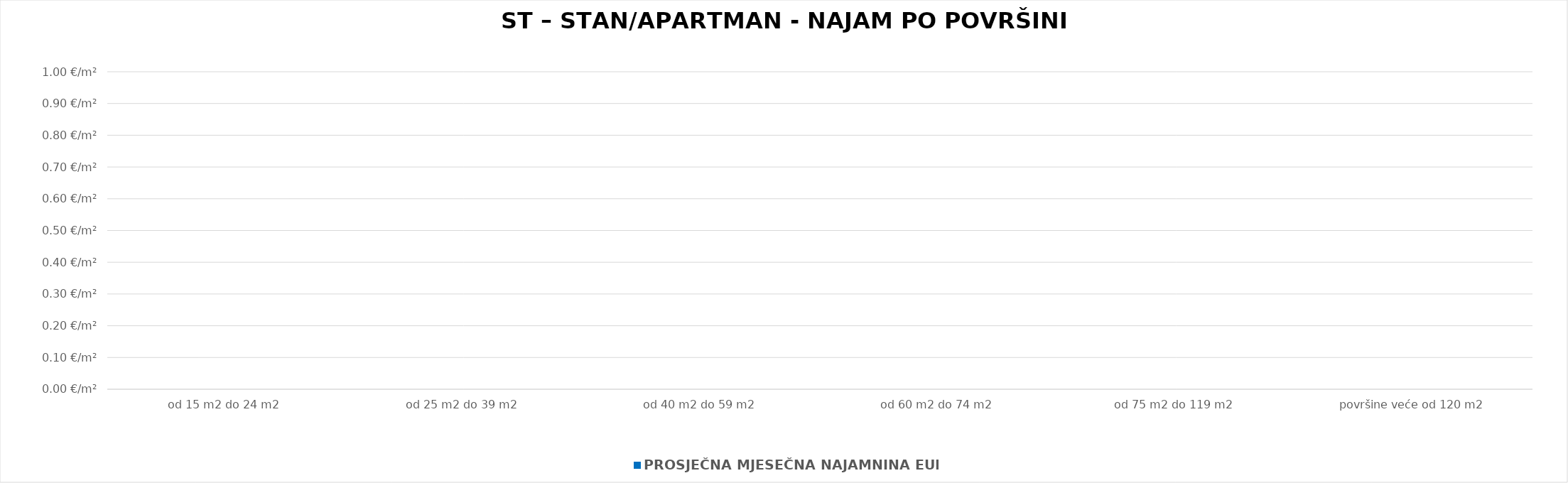
| Category | PROSJEČNA MJESEČNA NAJAMNINA EUR/m² |
|---|---|
| od 15 m2 do 24 m2 | 0 |
| od 25 m2 do 39 m2 | 0 |
| od 40 m2 do 59 m2 | 0 |
| od 60 m2 do 74 m2 | 0 |
| od 75 m2 do 119 m2 | 0 |
| površine veće od 120 m2 | 0 |